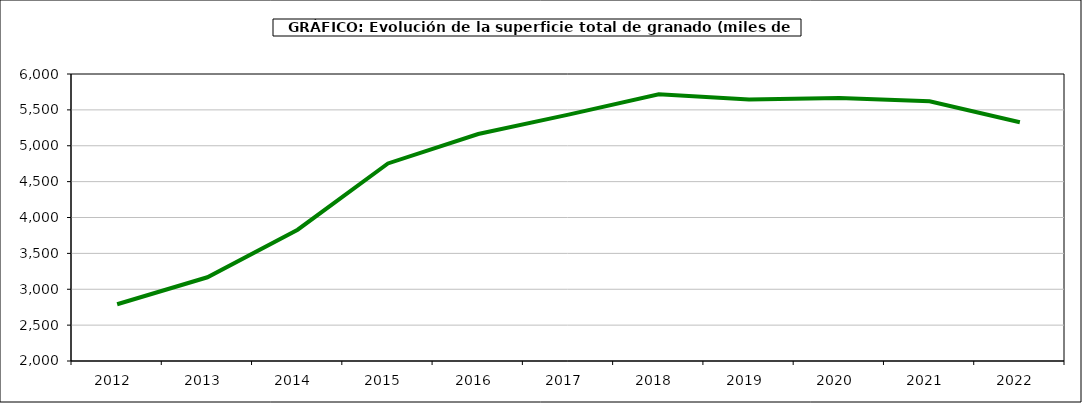
| Category | superficie granado |
|---|---|
| 2012.0 | 2791 |
| 2013.0 | 3167 |
| 2014.0 | 3830 |
| 2015.0 | 4753 |
| 2016.0 | 5163 |
| 2017.0 | 5434 |
| 2018.0 | 5716 |
| 2019.0 | 5645 |
| 2020.0 | 5666 |
| 2021.0 | 5619 |
| 2022.0 | 5327 |